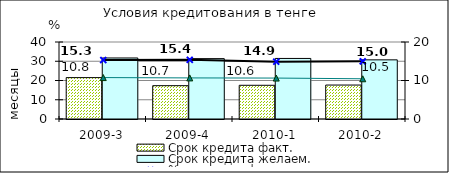
| Category | Срок кредита факт.  | Срок кредита желаем. |
|---|---|---|
| 2009-3 | 21.5 | 31.7 |
| 2009-4 | 17.31 | 31.36 |
| 2010-1 | 17.51 | 31.46 |
| 2010-2 | 17.63 | 30.73 |